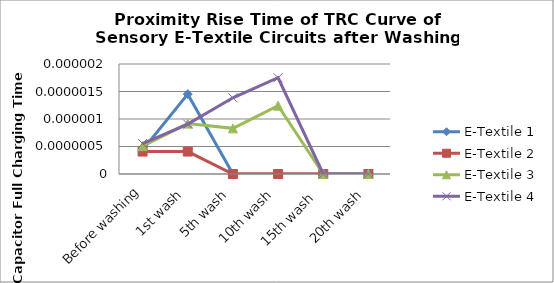
| Category | E-Textile 1 | E-Textile 2 | E-Textile 3 | E-Textile 4 |
|---|---|---|---|---|
| Before washing | 0 | 0 | 0 | 0 |
| 1st wash | 0 | 0 | 0 | 0 |
| 5th wash | 0 | 0 | 0 | 0 |
| 10th wash | 0 | 0 | 0 | 0 |
| 15th wash  | 0 | 0 | 0 | 0 |
| 20th wash | 0 | 0 | 0 | 0 |